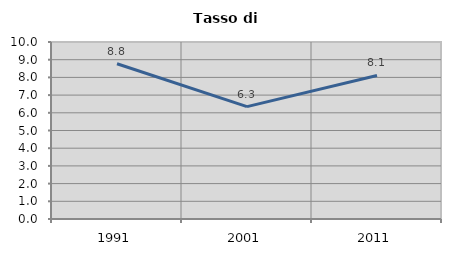
| Category | Tasso di disoccupazione   |
|---|---|
| 1991.0 | 8.772 |
| 2001.0 | 6.349 |
| 2011.0 | 8.108 |